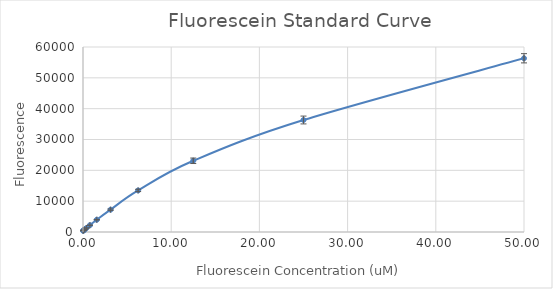
| Category | Series 0 |
|---|---|
| 50.0 | 56341.75 |
| 25.0 | 36326 |
| 12.5 | 23094 |
| 6.25 | 13482 |
| 3.125 | 7237.25 |
| 1.5625 | 3977 |
| 0.78125 | 2201.25 |
| 0.390625 | 1282.75 |
| 0.1953125 | 814.5 |
| 0.09765625 | 596 |
| 0.048828125 | 476.75 |
| 0.0 | 429.75 |